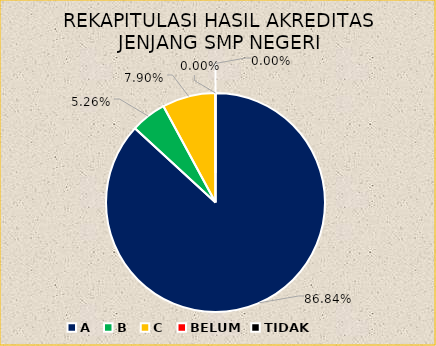
| Category | REKAPITULASI HASIL AKREDITASI JENJANG SMP NEGERI |
|---|---|
| A | 33 |
| B | 2 |
| C | 3 |
| BELUM | 0 |
| TIDAK | 0 |